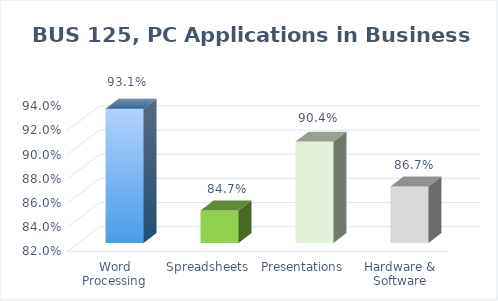
| Category | Series 0 |
|---|---|
| Word Processing | 0.931 |
| Spreadsheets | 0.847 |
| Presentations | 0.904 |
| Hardware & Software | 0.867 |